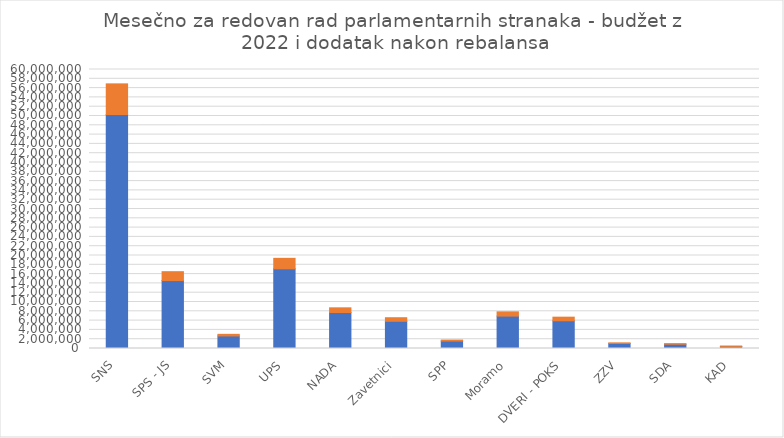
| Category | Series 0 | Series 1 |
|---|---|---|
| SNS | 50318513.2 | 6593828.993 |
| SPS - JS | 14605072.518 | 1913875.122 |
| SVM | 2692864.982 | 352877.899 |
| UPS | 17140995.021 | 2246186.995 |
| NADA | 7734370.07 | 1013525.845 |
| Zavetnici | 5852687.894 | 766946.809 |
| SPP | 1600636.838 | 209750.347 |
| Moramo | 6969070.697 | 913239.631 |
| DVERI - POKS | 5957908.744 | 780735.139 |
| ZZV | 1072627.598 | 140559.061 |
| SDA | 917653.806 | 120251.015 |
| KAD | 453848.632 | 59473.146 |